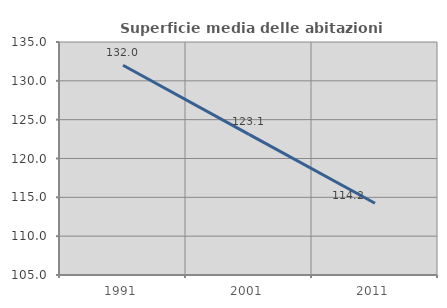
| Category | Superficie media delle abitazioni occupate |
|---|---|
| 1991.0 | 132.003 |
| 2001.0 | 123.114 |
| 2011.0 | 114.237 |